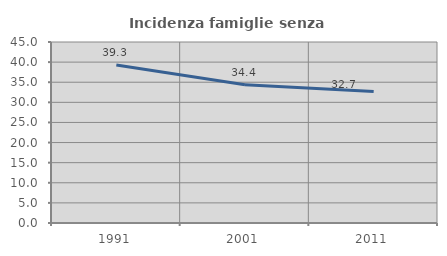
| Category | Incidenza famiglie senza nuclei |
|---|---|
| 1991.0 | 39.302 |
| 2001.0 | 34.375 |
| 2011.0 | 32.692 |